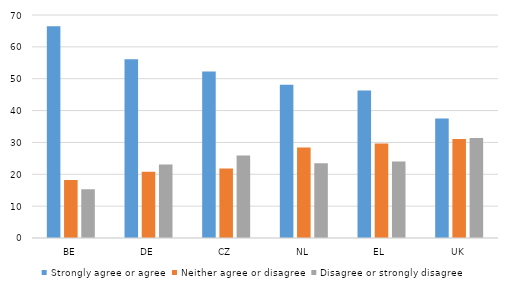
| Category | Strongly agree or agree | Neither agree or disagree | Disagree or strongly disagree |
|---|---|---|---|
| BE | 66.5 | 18.2 | 15.3 |
| DE | 56.1 | 20.8 | 23.1 |
| CZ | 52.3 | 21.8 | 25.9 |
| NL | 48.1 | 28.4 | 23.5 |
| EL | 46.3 | 29.7 | 24 |
| UK | 37.5 | 31.1 | 31.4 |